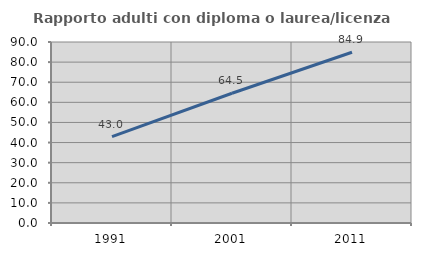
| Category | Rapporto adulti con diploma o laurea/licenza media  |
|---|---|
| 1991.0 | 42.991 |
| 2001.0 | 64.527 |
| 2011.0 | 84.9 |